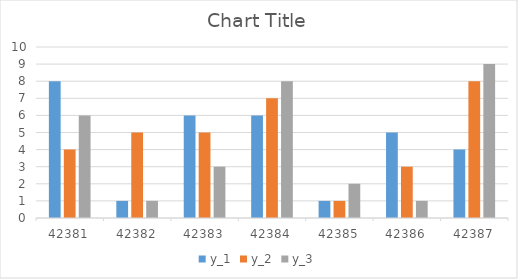
| Category | y_1 | y_2 | y_3 |
|---|---|---|---|
| 1/12/16 | 8 | 4 | 6 |
| 1/13/16 | 1 | 5 | 1 |
| 1/14/16 | 6 | 5 | 3 |
| 1/15/16 | 6 | 7 | 8 |
| 1/16/16 | 1 | 1 | 2 |
| 1/17/16 | 5 | 3 | 1 |
| 1/18/16 | 4 | 8 | 9 |